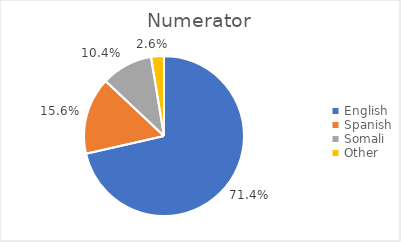
| Category | Numerator |
|---|---|
| English | 55 |
| Spanish | 12 |
| Somali | 8 |
| Other | 2 |